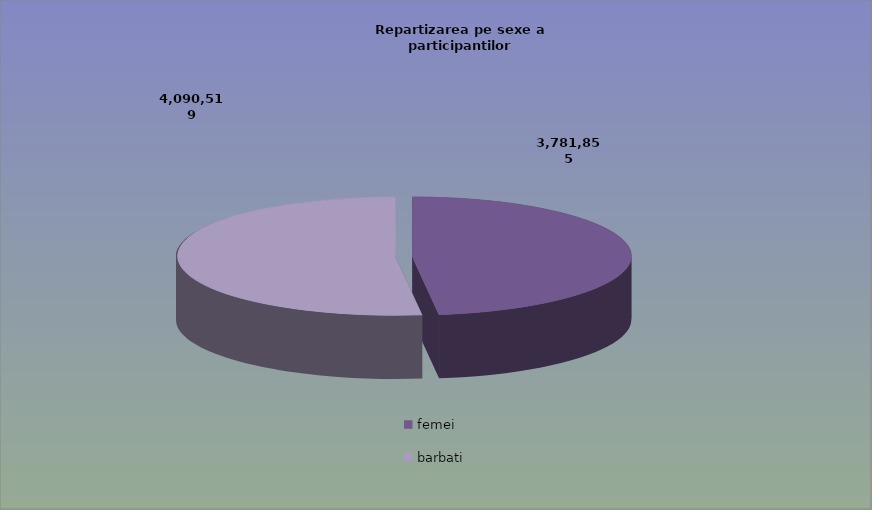
| Category | Series 0 |
|---|---|
| femei | 3781855 |
| barbati | 4090519 |